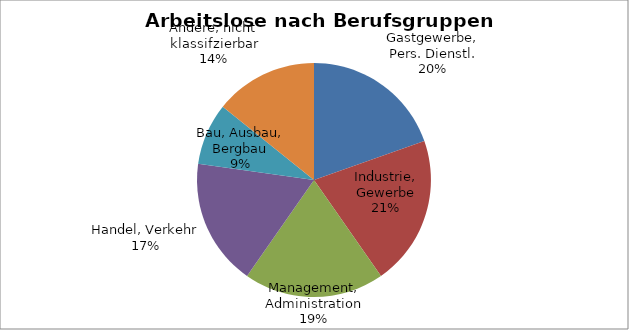
| Category | Series 0 |
|---|---|
| Gastgewerbe, Pers. Dienstl. | 0.197 |
| Industrie, Gewerbe | 0.208 |
| Management, Administration | 0.195 |
| Handel, Verkehr | 0.176 |
| Bau, Ausbau, Bergbau | 0.086 |
| Andere, nicht klassifzierbar | 0.143 |